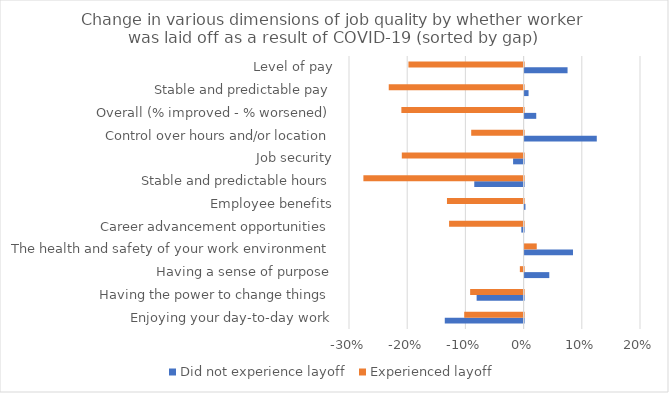
| Category | Did not experience layoff | Experienced layoff |
|---|---|---|
| Enjoying your day-to-day work | -0.135 | -0.102 |
| Having the power to change things | -0.081 | -0.092 |
| Having a sense of purpose | 0.042 | -0.006 |
| The health and safety of your work environment | 0.083 | 0.021 |
| Career advancement opportunities | -0.004 | -0.128 |
| Employee benefits | 0.001 | -0.132 |
| Stable and predictable hours | -0.085 | -0.275 |
| Job security | -0.018 | -0.209 |
| Control over hours and/or location | 0.124 | -0.09 |
| Overall (% improved - % worsened) | 0.02 | -0.21 |
| Stable and predictable pay | 0.007 | -0.232 |
| Level of pay | 0.074 | -0.198 |